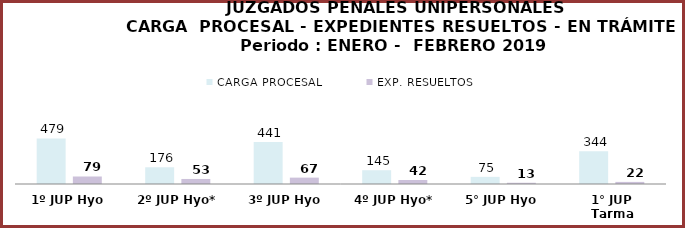
| Category | CARGA PROCESAL | EXP. RESUELTOS |
|---|---|---|
| 1º JUP Hyo | 479 | 79 |
| 2º JUP Hyo* | 176 | 53 |
| 3º JUP Hyo | 441 | 67 |
| 4º JUP Hyo* | 145 | 42 |
| 5° JUP Hyo | 75 | 13 |
| 1° JUP Tarma | 344 | 22 |